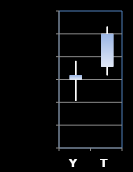
| Category | Series 0 | Series 1 | Series 2 | Series 3 |
|---|---|---|---|---|
| Y | 143 | 143.406 | 142.531 | 143.094 |
| T | 143.281 | 144.156 | 143.094 | 144 |